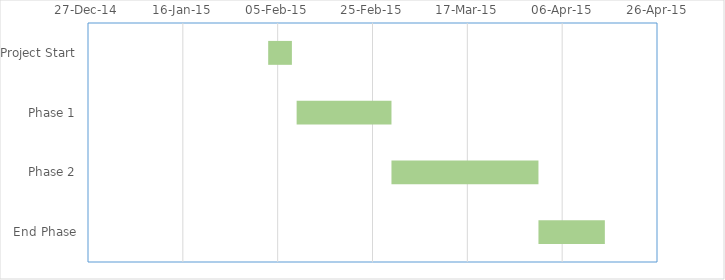
| Category | Start Date  | Duration ( in days) |
|---|---|---|
| Project Start | 2015-02-03 | 5 |
| Phase 1 | 2015-02-09 | 20 |
| Phase 2 | 2015-03-01 | 31 |
| End Phase | 2015-04-01 | 14 |